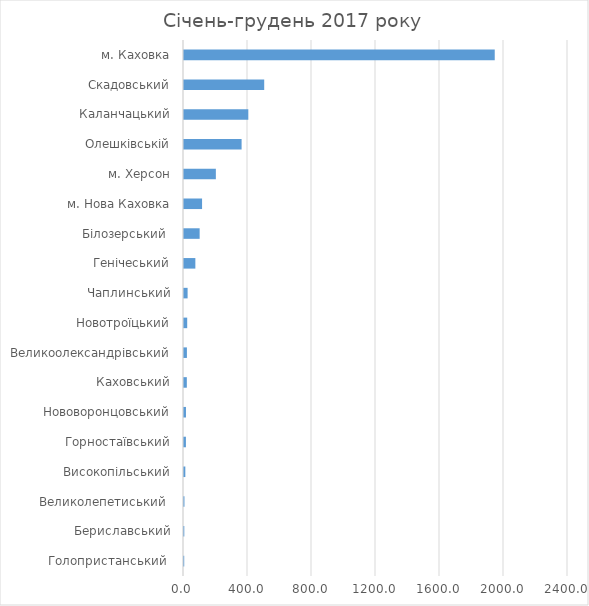
| Category | Series 0 |
|---|---|
| Голопристанський  | 1.4 |
| Бериславський | 1.9 |
| Великолепетиський  | 2.8 |
| Високопільський | 8.3 |
| Горностаївський | 12 |
| Нововоронцовський | 12.3 |
| Каховський | 17.7 |
| Великоолександрівський | 18.2 |
| Новотроїцький | 20 |
| Чаплинський | 22.5 |
| Генічеський | 71 |
| Білозерський  | 97.8 |
| м. Нова Каховка | 112.9 |
| м. Херсон | 199.1 |
| Олешківській | 360 |
| Каланчацький | 402 |
| Скадовський | 501.3 |
| м. Каховка | 1942.1 |